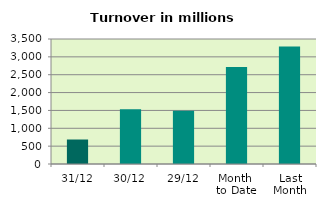
| Category | Series 0 |
|---|---|
| 31/12 | 685.776 |
| 30/12 | 1530.828 |
| 29/12 | 1490.572 |
| Month 
to Date | 2717.391 |
| Last
Month | 3292.145 |